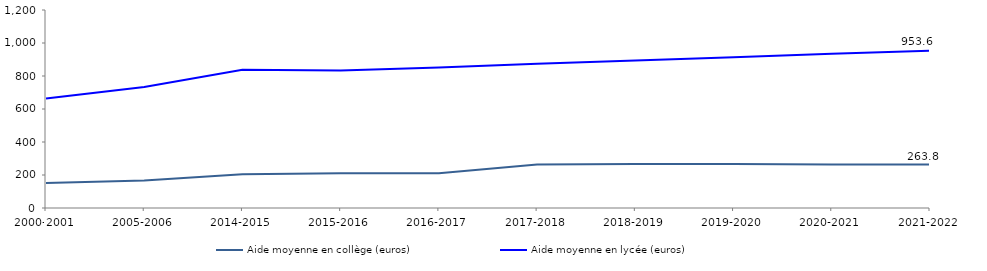
| Category | Aide moyenne en collège (euros) | Aide moyenne en lycée (euros) |
|---|---|---|
| 2000-2001 | 152.1 | 664 |
| 2005-2006 | 167.04 | 733 |
| 2014-2015 | 204.77 | 837.671 |
| 2015-2016 | 209.984 | 834.06 |
| 2016-2017 | 210.782 | 850.906 |
| 2017-2018 | 264.156 | 874.61 |
| 2018-2019 | 265.969 | 893.744 |
| 2019-2020 | 266.8 | 914 |
| 2020-2021 | 263.4 | 934.2 |
| 2021-2022 | 263.8 | 953.6 |